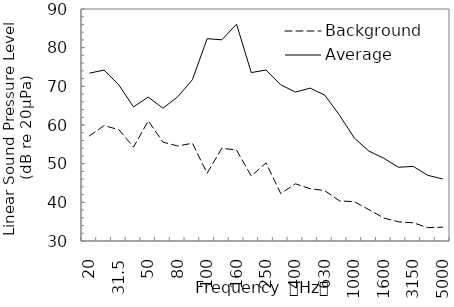
| Category | Background | Average |
|---|---|---|
| 20.0 | 57.163 | 73.401 |
| 25.0 | 59.839 | 74.204 |
| 31.5 | 58.799 | 70.379 |
| 40.0 | 54.269 | 64.669 |
| 50.0 | 61.065 | 67.231 |
| 63.0 | 55.57 | 64.328 |
| 80.0 | 54.562 | 67.299 |
| 100.0 | 55.282 | 71.71 |
| 100.0 | 47.522 | 82.322 |
| 125.0 | 54.008 | 82.033 |
| 160.0 | 53.518 | 86.068 |
| 200.0 | 46.794 | 73.557 |
| 250.0 | 50.211 | 74.214 |
| 315.0 | 42.276 | 70.403 |
| 400.0 | 44.797 | 68.506 |
| 500.0 | 43.521 | 69.538 |
| 630.0 | 43.024 | 67.692 |
| 800.0 | 40.364 | 62.508 |
| 1000.0 | 40.165 | 56.618 |
| 1250.0 | 38.086 | 53.234 |
| 1600.0 | 35.949 | 51.405 |
| 2000.0 | 34.971 | 49.065 |
| 3150.0 | 34.706 | 49.297 |
| 4000.0 | 33.443 | 46.979 |
| 5000.0 | 33.581 | 46.047 |